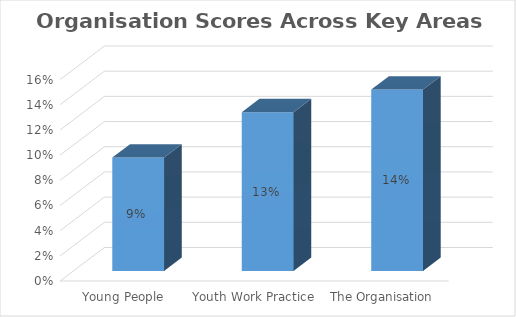
| Category | Series 0 |
|---|---|
| Young People | 0.09 |
| Youth Work Practice | 0.126 |
| The Organisation | 0.144 |